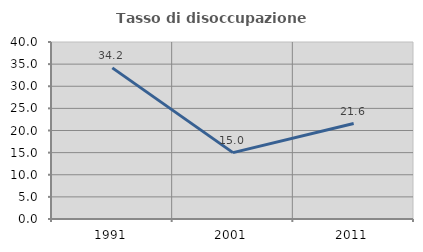
| Category | Tasso di disoccupazione giovanile  |
|---|---|
| 1991.0 | 34.154 |
| 2001.0 | 15 |
| 2011.0 | 21.569 |